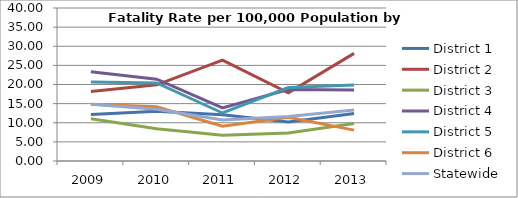
| Category | District 1 | District 2 | District 3 | District 4 | District 5 | District 6 | Statewide |
|---|---|---|---|---|---|---|---|
| 2009.0 | 12.169 | 18.183 | 11.019 | 23.334 | 20.665 | 14.818 | 14.831 |
| 2010.0 | 13.01 | 19.922 | 8.458 | 21.387 | 20.415 | 14.181 | 13.52 |
| 2011.0 | 12.114 | 26.361 | 6.709 | 13.903 | 12.55 | 9.078 | 10.707 |
| 2012.0 | 10.211 | 17.84 | 7.321 | 18.699 | 19.191 | 11.454 | 11.609 |
| 2013.0 | 12.411 | 28.146 | 9.828 | 18.532 | 19.863 | 8.074 | 13.348 |